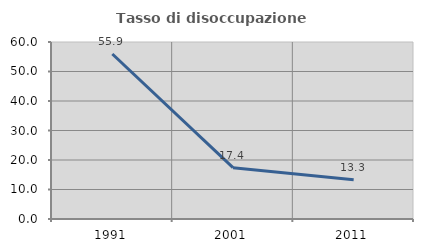
| Category | Tasso di disoccupazione giovanile  |
|---|---|
| 1991.0 | 55.932 |
| 2001.0 | 17.391 |
| 2011.0 | 13.333 |